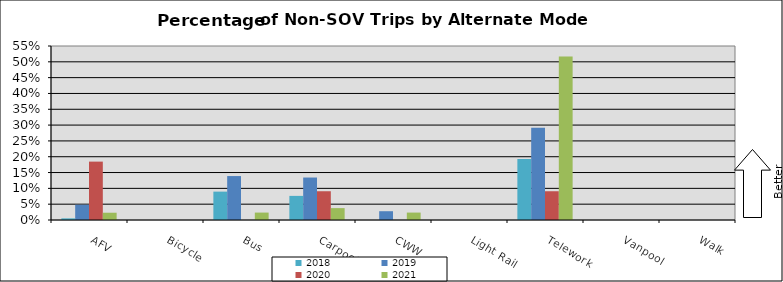
| Category | 2018 | 2019 | 2020 | 2021 |
|---|---|---|---|---|
| AFV | 0.005 | 0.048 | 0.185 | 0.023 |
| Bicycle | 0 | 0 | 0 | 0 |
| Bus | 0.09 | 0.139 | 0 | 0.023 |
| Carpool | 0.076 | 0.134 | 0.091 | 0.038 |
| CWW | 0 | 0.028 | 0 | 0.023 |
| Light Rail | 0 | 0 | 0 | 0 |
| Telework | 0.193 | 0.292 | 0.091 | 0.516 |
| Vanpool | 0 | 0 | 0 | 0 |
| Walk | 0 | 0 | 0 | 0 |